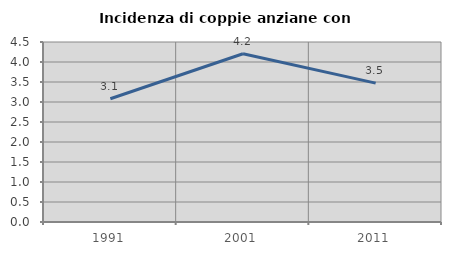
| Category | Incidenza di coppie anziane con figli |
|---|---|
| 1991.0 | 3.081 |
| 2001.0 | 4.205 |
| 2011.0 | 3.472 |